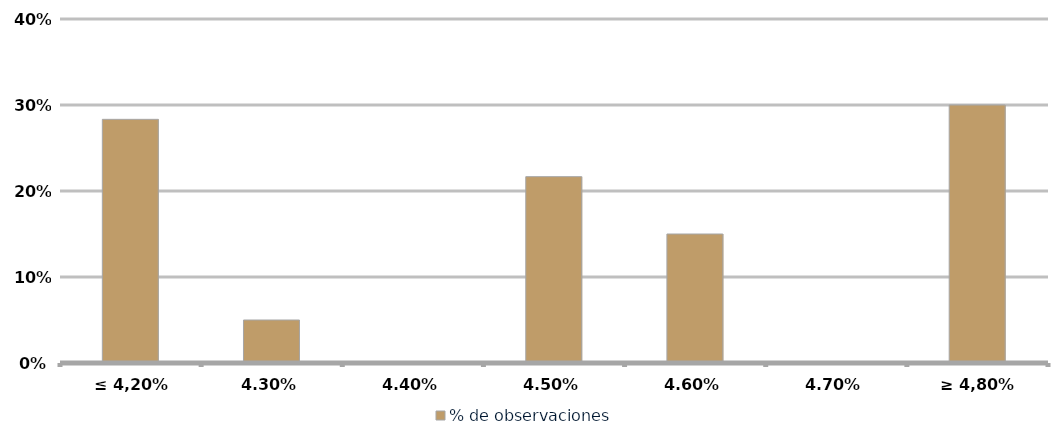
| Category | % de observaciones  |
|---|---|
| ≤ 4,20% | 0.283 |
| 4,30% | 0.05 |
| 4,40% | 0 |
| 4,50% | 0.217 |
| 4,60% | 0.15 |
| 4,70% | 0 |
| ≥ 4,80% | 0.3 |